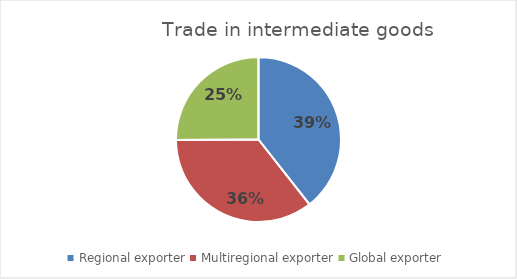
| Category | Trade in intermediate goods |
|---|---|
| Regional exporter | 0.394 |
| Multiregional exporter | 0.355 |
| Global exporter | 0.251 |